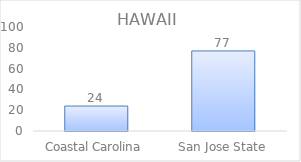
| Category | Series 0 |
|---|---|
| Coastal Carolina | 24 |
| San Jose State | 77 |